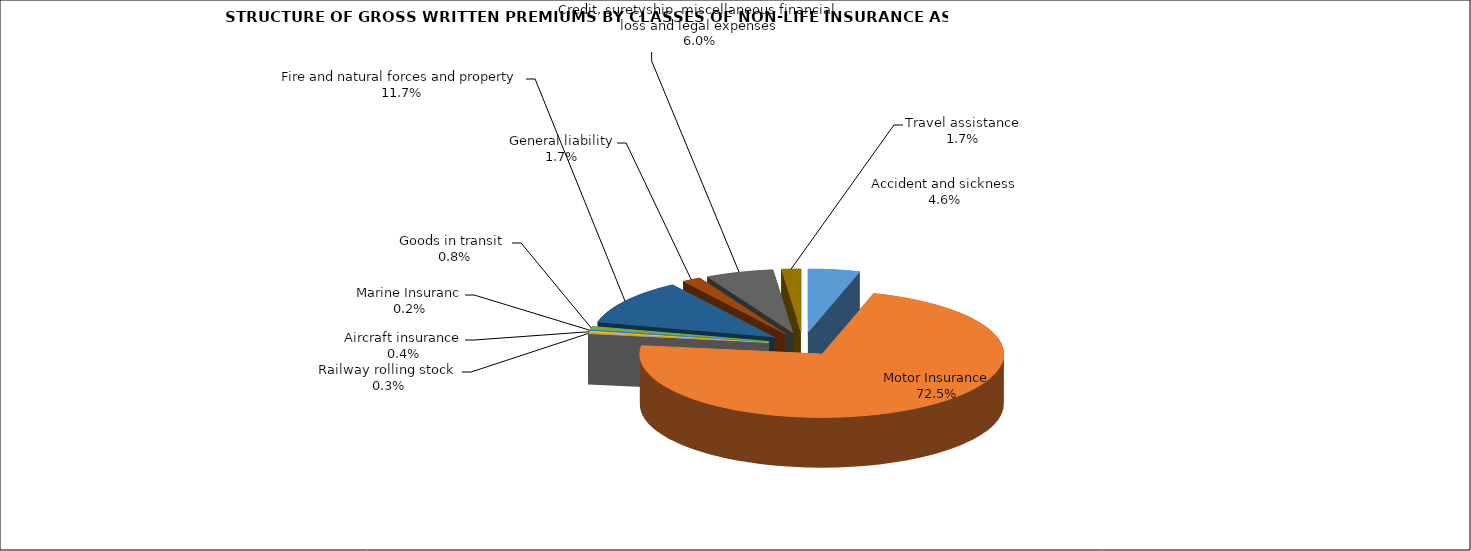
| Category | Accident and sickness |
|---|---|
| Accident and sickness | 0.046 |
| Motor Insurance | 0.725 |
| Railway rolling stock  | 0.003 |
| Aircraft insurance | 0.004 |
| Marine Insuranc | 0.002 |
| Goods in transit  | 0.008 |
| Fire and natural forces and property | 0.117 |
| General liability | 0.017 |
| Credit, suretyship, miscellaneous financial loss and legal expenses | 0.06 |
| Travel assistance | 0.017 |